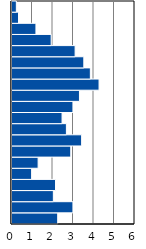
| Category | Series 0 |
|---|---|
| 0-4 | 2.229 |
| 5-9 | 2.972 |
| 10-14 | 2.017 |
| 15-19 | 2.123 |
| 20-24 | 0.955 |
| 25-29 | 1.274 |
| 30-34 | 2.866 |
| 35-39 | 3.397 |
| 40-44 | 2.654 |
| 45-49 | 2.442 |
| 50-54 | 2.972 |
| 55-59 | 3.291 |
| 60-64 | 4.246 |
| 65-69 | 3.822 |
| 70-74 | 3.503 |
| 75-79 | 3.079 |
| 80-84 | 1.911 |
| 85-89 | 1.168 |
| 90-94 | 0.318 |
| 95+ | 0.212 |